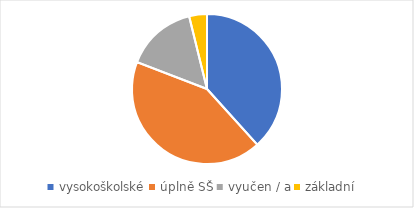
| Category | Series 0 |
|---|---|
| vysokoškolské | 100 |
| úplně SŠ | 111 |
| vyučen / a | 40 |
| základní | 10 |